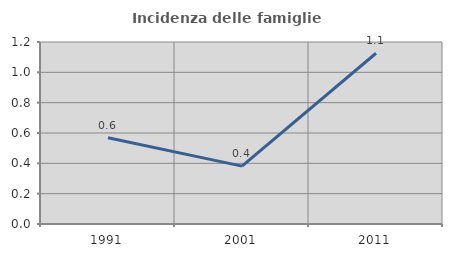
| Category | Incidenza delle famiglie numerose |
|---|---|
| 1991.0 | 0.569 |
| 2001.0 | 0.382 |
| 2011.0 | 1.126 |